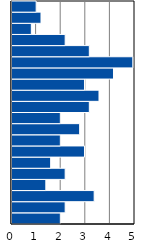
| Category | Series 0 |
|---|---|
| 0-4 | 1.965 |
| 5-9 | 2.161 |
| 10-14 | 3.34 |
| 15-19 | 1.375 |
| 20-24 | 2.161 |
| 25-29 | 1.572 |
| 30-34 | 2.947 |
| 35-39 | 1.965 |
| 40-44 | 2.75 |
| 45-49 | 1.965 |
| 50-54 | 3.143 |
| 55-59 | 3.536 |
| 60-64 | 2.947 |
| 65-69 | 4.126 |
| 70-74 | 4.912 |
| 75-79 | 3.143 |
| 80-84 | 2.161 |
| 85-89 | 0.786 |
| 90-94 | 1.179 |
| 95+ | 0.982 |